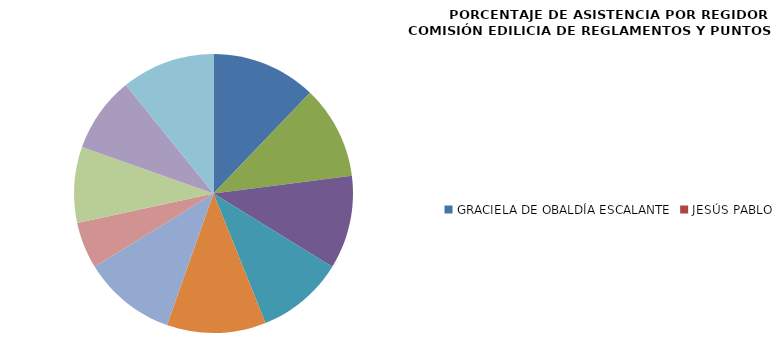
| Category | Series 0 |
|---|---|
| GRACIELA DE OBALDÍA ESCALANTE | 100 |
| JESÚS PABLO LEMUS NAVARRO | 0 |
| FABIOLA RAQUEL GPE. LOYA HERNÁNDEZ | 88.889 |
| OSCAR JAVIER RAMÍREZ CASTELLANOS | 88.889 |
| JOSÉ LUIS TOSTADO BASTIDAS | 83.333 |
| MARIO ALBERTO RODRÍGUEZ CARRILLO/ARMANDO GUZMÁN ESPARZA | 94.444 |
| ZOILA GUTIÉRREZ AVELAR | 88.889 |
| ISRAEL JACOBO BOJORQUEZ/LUIS GUILLERMO MARTÍNEZ MORA | 44.444 |
| ERIKA EUGENIA FÉLIX ÁNGELES | 72.222 |
| MICHELLE LEAÑO ACEVES | 72.222 |